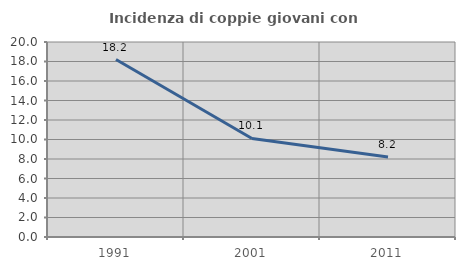
| Category | Incidenza di coppie giovani con figli |
|---|---|
| 1991.0 | 18.202 |
| 2001.0 | 10.106 |
| 2011.0 | 8.201 |